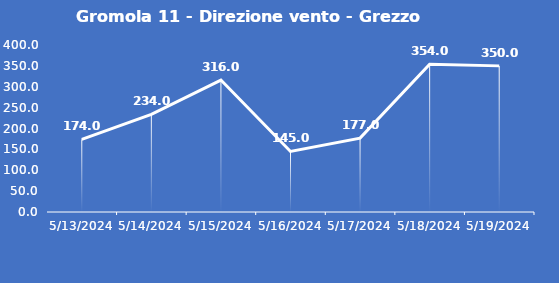
| Category | Gromola 11 - Direzione vento - Grezzo (°N) |
|---|---|
| 5/13/24 | 174 |
| 5/14/24 | 234 |
| 5/15/24 | 316 |
| 5/16/24 | 145 |
| 5/17/24 | 177 |
| 5/18/24 | 354 |
| 5/19/24 | 350 |